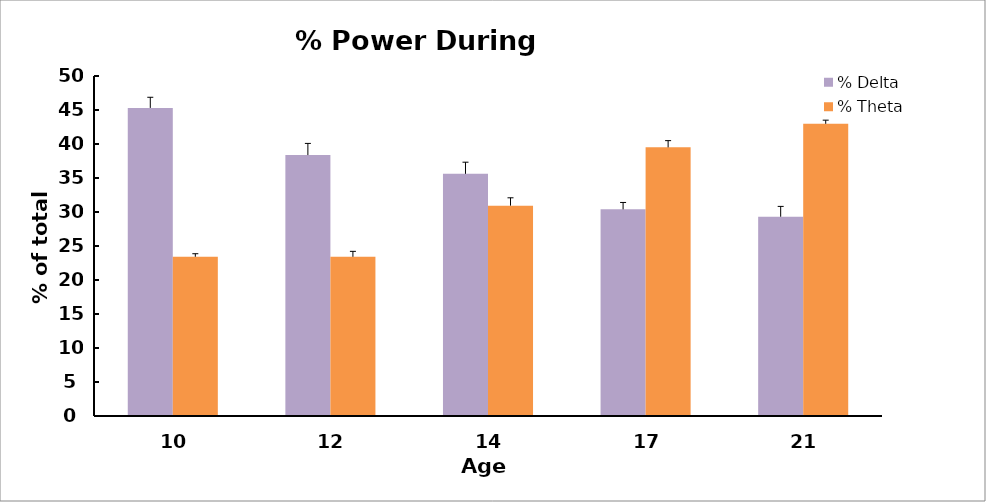
| Category | % Delta | % Theta  |
|---|---|---|
| 10 | 45.305 | 23.418 |
| 12 | 38.373 | 23.408 |
| 14 | 35.613 | 30.936 |
| 17 | 30.389 | 39.504 |
| 21 | 29.304 | 42.968 |